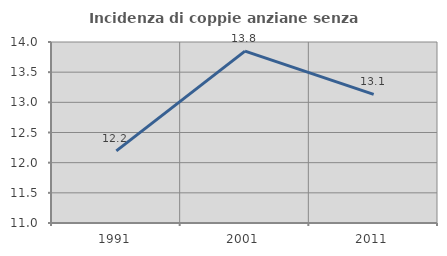
| Category | Incidenza di coppie anziane senza figli  |
|---|---|
| 1991.0 | 12.195 |
| 2001.0 | 13.849 |
| 2011.0 | 13.132 |